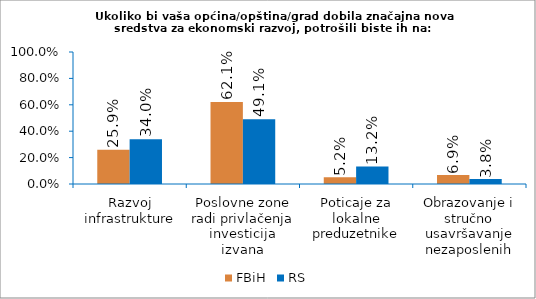
| Category | FBiH | RS |
|---|---|---|
| Razvoj infrastrukture | 0.259 | 0.34 |
| Poslovne zone radi privlačenja investicija izvana | 0.621 | 0.491 |
| Poticaje za lokalne preduzetnike | 0.052 | 0.132 |
| Obrazovanje i stručno usavršavanje nezaposlenih | 0.069 | 0.038 |